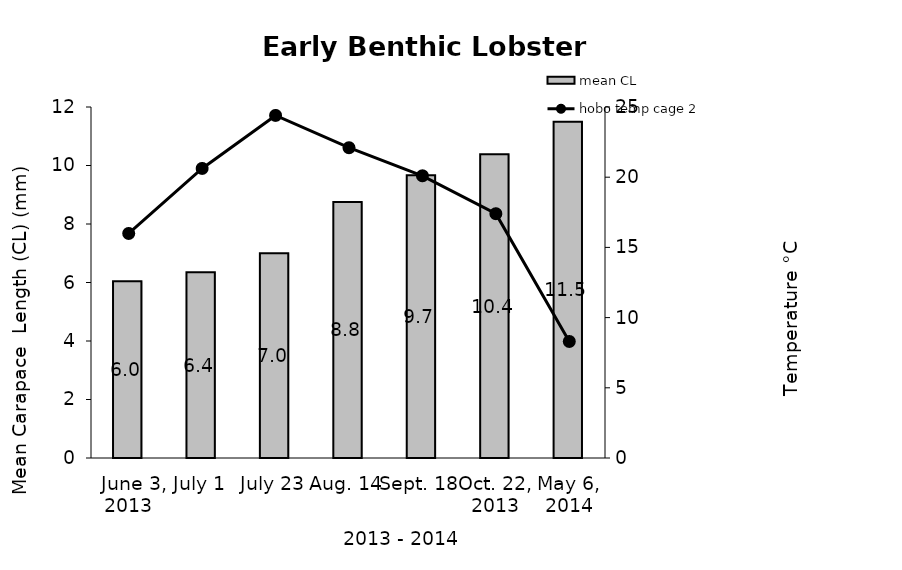
| Category | mean CL |
|---|---|
|   June 3, 2013 | 6.043 |
| July 1 | 6.354 |
| July 23 | 7.004 |
| Aug. 14 | 8.755 |
| Sept. 18 | 9.663 |
| Oct. 22, 2013 | 10.382 |
| May 6, 2014 | 11.498 |